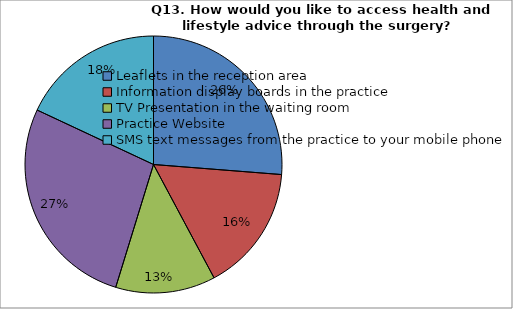
| Category | Series 0 |
|---|---|
| Leaflets in the reception area | 163 |
| Information display boards in the practice | 99 |
| TV Presentation in the waiting room | 78 |
| Practice Website | 169 |
| SMS text messages from the practice to your mobile phone | 112 |